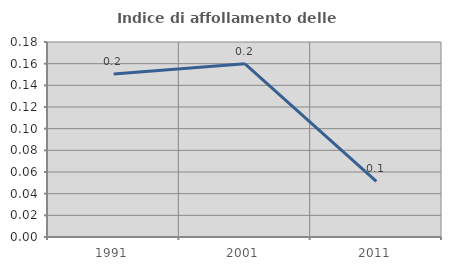
| Category | Indice di affollamento delle abitazioni  |
|---|---|
| 1991.0 | 0.15 |
| 2001.0 | 0.16 |
| 2011.0 | 0.051 |